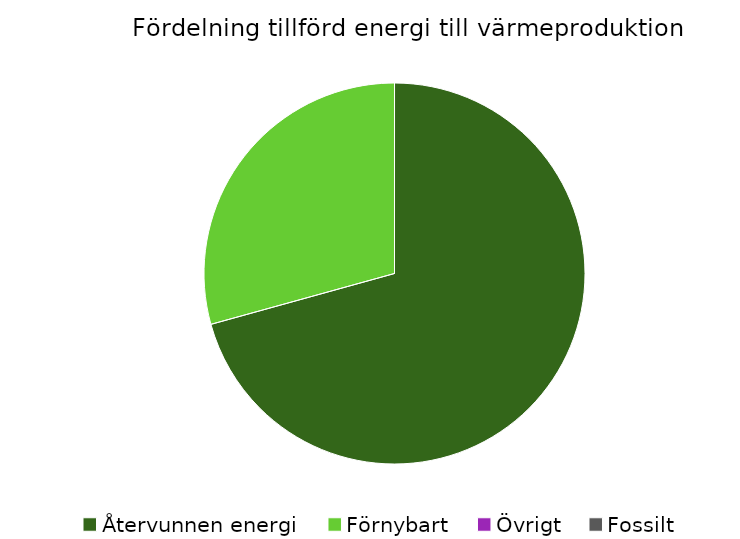
| Category | Fördelning värmeproduktion |
|---|---|
| Återvunnen energi | 0.707 |
| Förnybart | 0.293 |
| Övrigt | 0 |
| Fossilt | 0 |